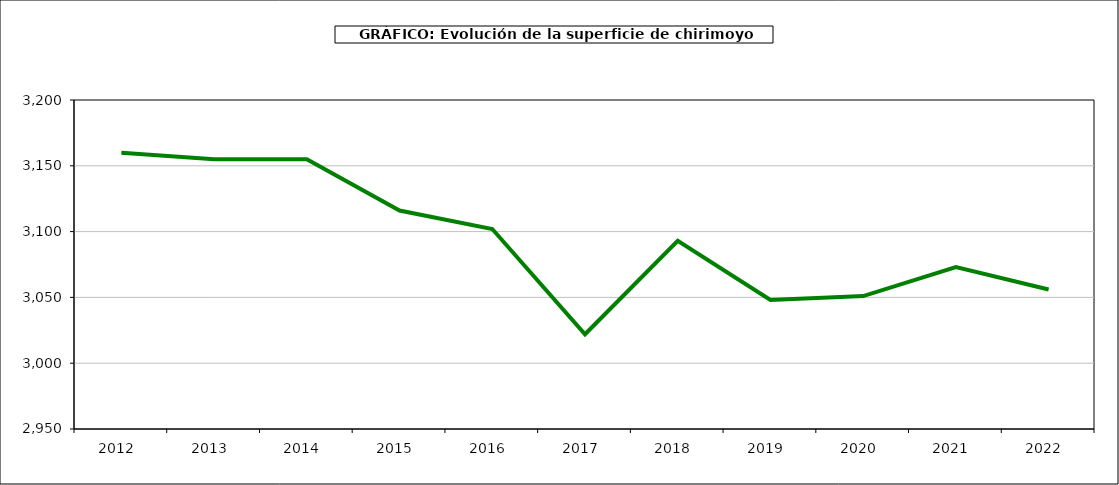
| Category | superficie chirimoyo |
|---|---|
| 2012.0 | 3160 |
| 2013.0 | 3155 |
| 2014.0 | 3155 |
| 2015.0 | 3116 |
| 2016.0 | 3102 |
| 2017.0 | 3022 |
| 2018.0 | 3093 |
| 2019.0 | 3048 |
| 2020.0 | 3051 |
| 2021.0 | 3073 |
| 2022.0 | 3056 |